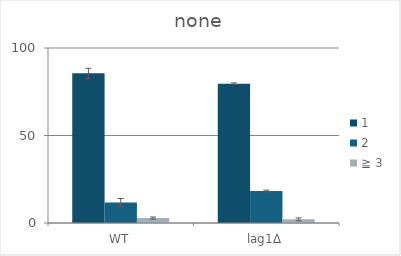
| Category | 1 | 2 | ≧ 3 |
|---|---|---|---|
| WT | 85.515 | 11.669 | 2.816 |
| lag1∆ | 79.632 | 18.283 | 2.085 |